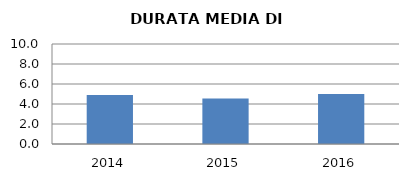
| Category | 2014 2015 2016 |
|---|---|
| 2014.0 | 4.903 |
| 2015.0 | 4.54 |
| 2016.0 | 5 |